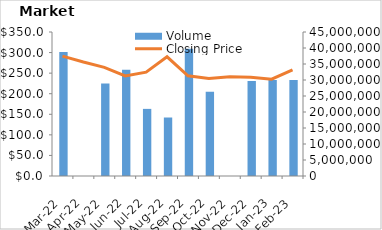
| Category | Volume |
|---|---|
| 2023-02-17 | 30014458 |
| 2023-01-18 | 30028814 |
| 2022-12-19 | 29697844 |
| 2022-11-17 | 0 |
| 2022-10-18 | 26330076 |
| 2022-09-16 | 39791925 |
| 2022-08-17 | 18278393 |
| 2022-07-18 | 20975252 |
| 2022-06-16 | 33169170 |
| 2022-05-17 | 28887563 |
| 2022-04-15 | 0 |
| 2022-03-16 | 38755017 |